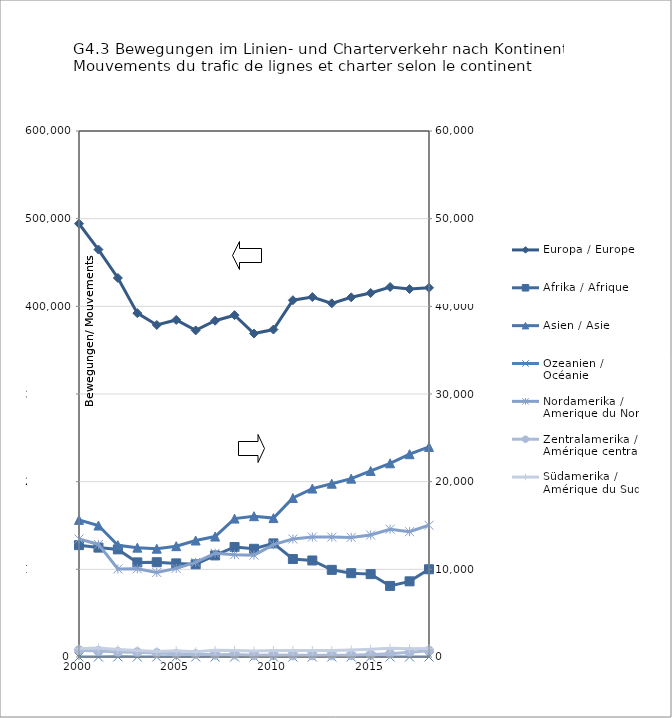
| Category | Europa / Europe |
|---|---|
| 2000.0 | 494247 |
| 2001.0 | 464792 |
| 2002.0 | 432368 |
| 2003.0 | 392219 |
| 2004.0 | 378737 |
| 2005.0 | 384453 |
| 2006.0 | 372550 |
| 2007.0 | 383593 |
| 2008.0 | 389901 |
| 2009.0 | 368933 |
| 2010.0 | 373520 |
| 2011.0 | 406994 |
| 2012.0 | 410573 |
| 2013.0 | 403430 |
| 2014.0 | 410285 |
| 2015.0 | 415226 |
| 2016.0 | 422070 |
| 2017.0 | 419704 |
| 2018.0 | 421183 |